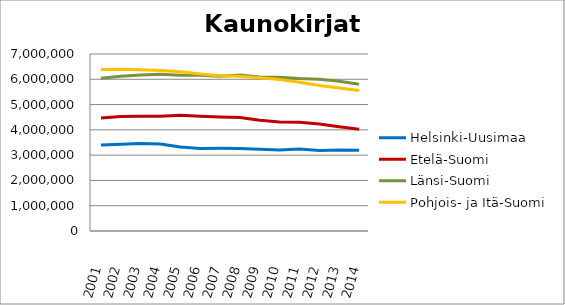
| Category | Helsinki-Uusimaa | Etelä-Suomi | Länsi-Suomi | Pohjois- ja Itä-Suomi |
|---|---|---|---|---|
| 2001.0 | 3400122 | 4473472 | 6042998 | 6391001 |
| 2002.0 | 3432050 | 4527232 | 6119336 | 6397238 |
| 2003.0 | 3456792 | 4538083 | 6165010 | 6380049 |
| 2004.0 | 3440909 | 4536021 | 6194671 | 6343699 |
| 2005.0 | 3323679 | 4574173 | 6157037 | 6300178 |
| 2006.0 | 3264780 | 4540694 | 6158745 | 6211066 |
| 2007.0 | 3268704 | 4510892 | 6118035 | 6135854 |
| 2008.0 | 3262501 | 4489323 | 6170262 | 6118265 |
| 2009.0 | 3230570 | 4383447 | 6091586 | 6058811 |
| 2010.0 | 3198609 | 4308222 | 6080920 | 5992808 |
| 2011.0 | 3240538 | 4302031 | 6027804 | 5886264 |
| 2012.0 | 3186226 | 4228330 | 5996943 | 5754414 |
| 2013.0 | 3205723 | 4126075 | 5924367 | 5651586 |
| 2014.0 | 3196551 | 4025294 | 5803744 | 5552546 |